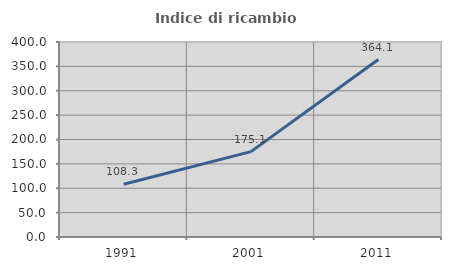
| Category | Indice di ricambio occupazionale  |
|---|---|
| 1991.0 | 108.324 |
| 2001.0 | 175.07 |
| 2011.0 | 364.087 |